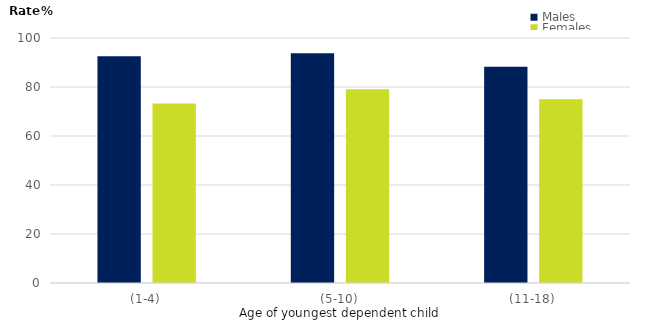
| Category | Males | Females |
|---|---|---|
| (1-4) | 92.6 | 73.3 |
| (5-10) | 93.8 | 79.1 |
| (11-18) | 88.3 | 75 |